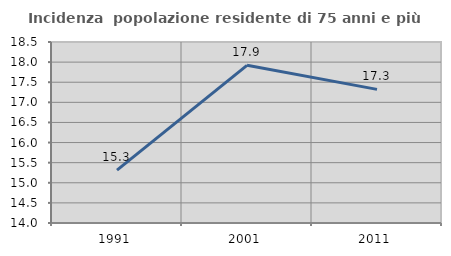
| Category | Incidenza  popolazione residente di 75 anni e più |
|---|---|
| 1991.0 | 15.315 |
| 2001.0 | 17.921 |
| 2011.0 | 17.322 |